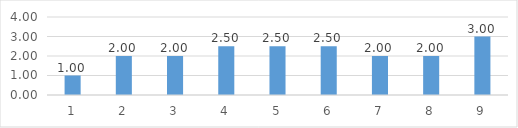
| Category | Series 0 |
|---|---|
| 0 | 1 |
| 1 | 2 |
| 2 | 2 |
| 3 | 2.5 |
| 4 | 2.5 |
| 5 | 2.5 |
| 6 | 2 |
| 7 | 2 |
| 8 | 3 |